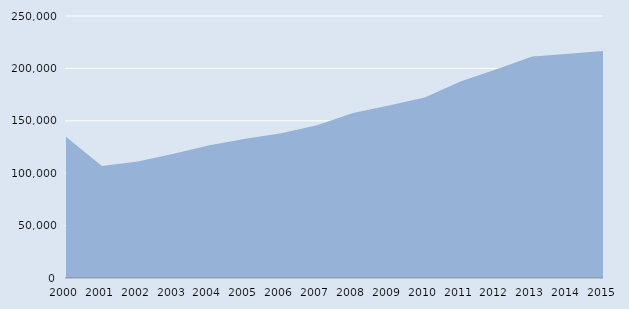
| Category | Series 0 |
|---|---|
| 2000.0 | 134675 |
| 2001.0 | 106828 |
| 2002.0 | 111106 |
| 2003.0 | 118521 |
| 2004.0 | 126789 |
| 2005.0 | 132872 |
| 2006.0 | 138065 |
| 2007.0 | 145736 |
| 2008.0 | 157455 |
| 2009.0 | 164691 |
| 2010.0 | 172274 |
| 2011.0 | 187409 |
| 2012.0 | 199209 |
| 2013.0 | 211451 |
| 2014.0 | 214079 |
| 2015.0 | 216714 |